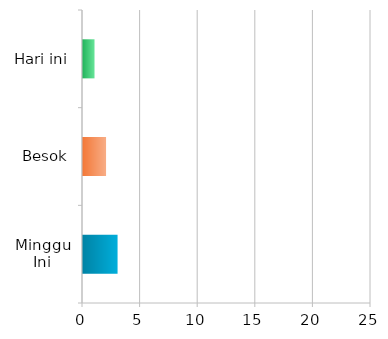
| Category | Series 0 |
|---|---|
| Minggu Ini | 3 |
| Besok | 2 |
| Hari ini | 1 |